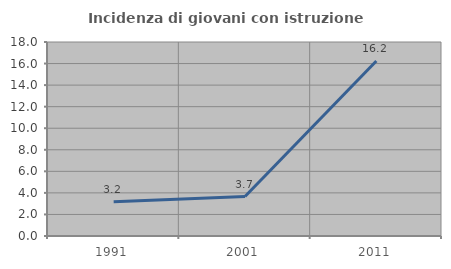
| Category | Incidenza di giovani con istruzione universitaria |
|---|---|
| 1991.0 | 3.175 |
| 2001.0 | 3.659 |
| 2011.0 | 16.239 |